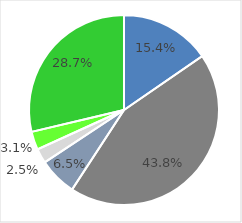
| Category | Series 0 |
|---|---|
| Kernenergie | 0.154 |
| Kohle | 0.438 |
| Erdgas | 0.065 |
| Sonstige fossile Energieträger | 0.025 |
| Sonstige erneuerbare Energien | 0.031 |
| Erneuerbare Energien, _x000d_gefördert nach dem EEG | 0.287 |